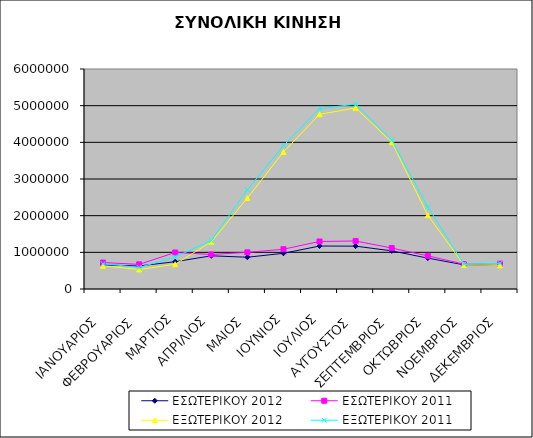
| Category | ΕΣΩΤΕΡΙΚΟΥ 2012 | ΕΣΩΤΕΡΙΚΟΥ 2011 | ΕΞΩΤΕΡΙΚΟΥ 2012 | ΕΞΩΤΕΡΙΚΟΥ 2011 |
|---|---|---|---|---|
| ΙΑΝΟΥΑΡΙΟΣ | 655412 | 721027 | 631602 | 690447 |
| ΦΕΒΡΟΥΑΡΙΟΣ | 628651 | 671939 | 531855 | 586949 |
| ΜΑΡΤΙΟΣ | 744691 | 995814 | 674789 | 873552 |
| ΑΠΡΙΛΙΟΣ | 905507 | 941397 | 1288395 | 1321447 |
| ΜΑΙΟΣ | 865955 | 999706 | 2479653 | 2707386 |
| ΙΟΥΝΙΟΣ | 974104 | 1085296 | 3735774 | 3908577 |
| ΙΟΥΛΙΟΣ | 1171611 | 1296239 | 4763392 | 4917320 |
| ΑΥΓΟΥΣΤΟΣ | 1168882 | 1309822 | 4938287 | 5042617 |
| ΣΕΠΤΕΜΒΡΙΟΣ | 1040615 | 1117006 | 4006021 | 4066836 |
| ΟΚΤΩΒΡΙΟΣ | 842389 | 905226 | 2011008 | 2239166 |
| ΝΟΕΜΒΡΙΟΣ | 659371 | 676598 | 657381 | 681422 |
| ΔΕΚΕΜΒΡΙΟΣ | 639079 | 691989 | 643707 | 699482 |